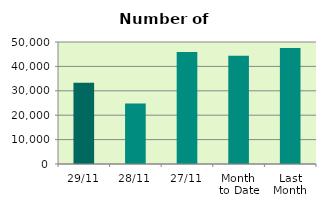
| Category | Series 0 |
|---|---|
| 29/11 | 33308 |
| 28/11 | 24822 |
| 27/11 | 45854 |
| Month 
to Date | 44331.238 |
| Last
Month | 47528 |